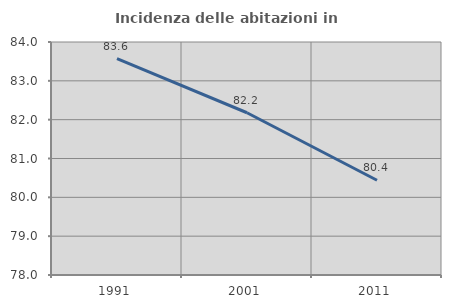
| Category | Incidenza delle abitazioni in proprietà  |
|---|---|
| 1991.0 | 83.57 |
| 2001.0 | 82.178 |
| 2011.0 | 80.441 |